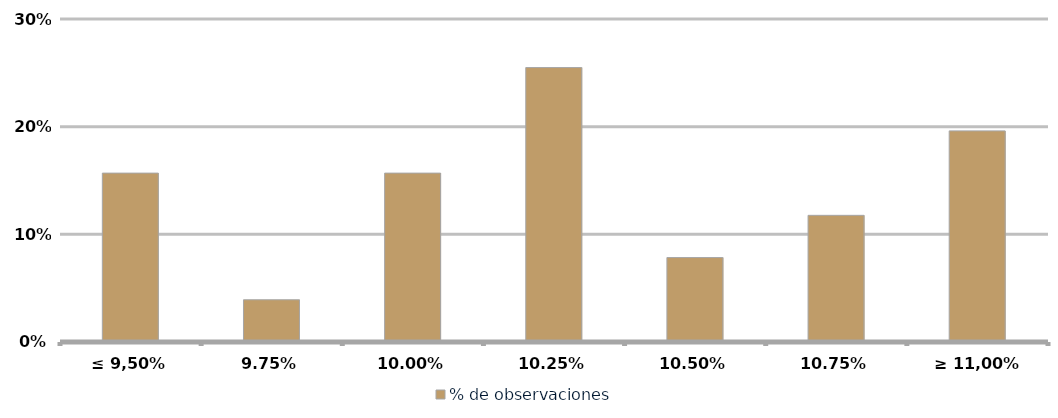
| Category | % de observaciones  |
|---|---|
| ≤ 9,50% | 0.157 |
| 9,75% | 0.039 |
| 10,00% | 0.157 |
| 10,25% | 0.255 |
| 10,50% | 0.078 |
| 10,75% | 0.118 |
| ≥ 11,00% | 0.196 |